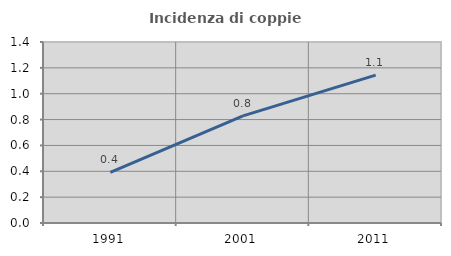
| Category | Incidenza di coppie miste |
|---|---|
| 1991.0 | 0.391 |
| 2001.0 | 0.828 |
| 2011.0 | 1.144 |